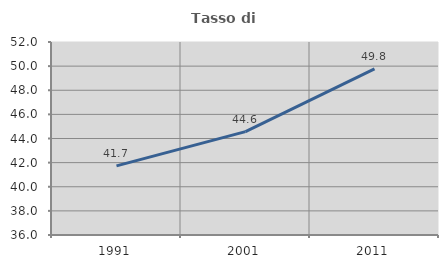
| Category | Tasso di occupazione   |
|---|---|
| 1991.0 | 41.729 |
| 2001.0 | 44.569 |
| 2011.0 | 49.775 |